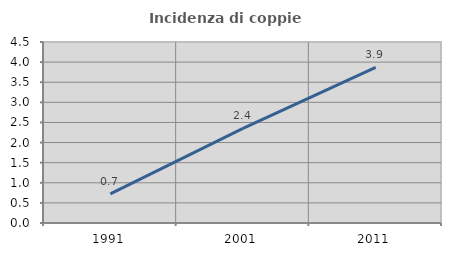
| Category | Incidenza di coppie miste |
|---|---|
| 1991.0 | 0.726 |
| 2001.0 | 2.35 |
| 2011.0 | 3.868 |